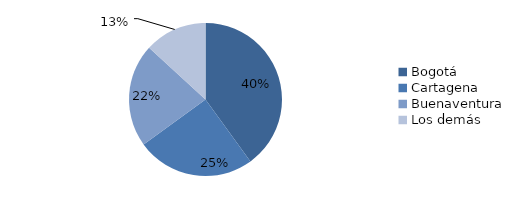
| Category | Series 0 |
|---|---|
| Bogotá | 1295.294 |
| Cartagena | 809.447 |
| Buenaventura | 705.955 |
| Los demás | 427.202 |